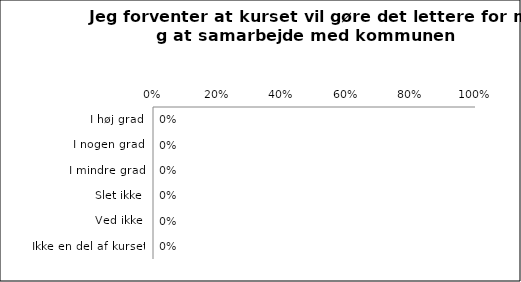
| Category | Jeg forventer, at kurset vil gøre det lettere for mig at samarbejde med kommunen |
|---|---|
| I høj grad | 0 |
| I nogen grad | 0 |
| I mindre grad | 0 |
| Slet ikke | 0 |
| Ved ikke | 0 |
| Ikke en del af kurset | 0 |